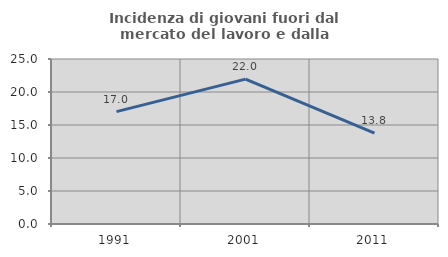
| Category | Incidenza di giovani fuori dal mercato del lavoro e dalla formazione  |
|---|---|
| 1991.0 | 17.031 |
| 2001.0 | 21.953 |
| 2011.0 | 13.786 |